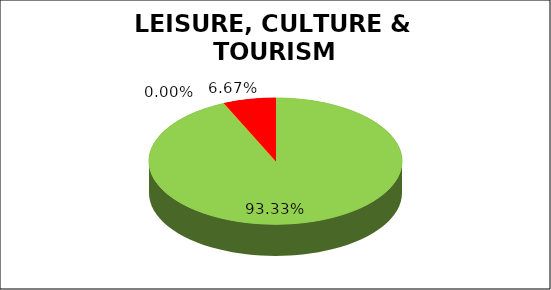
| Category | Q3 |
|---|---|
| Green | 0.933 |
| Amber | 0 |
| Red | 0.067 |